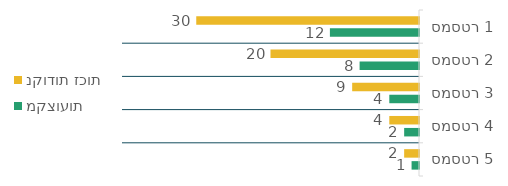
| Category | נקודות זכות  | מקצועות  |
|---|---|---|
| סמסטר 1 | 30 | 12 |
| סמסטר 2 | 20 | 8 |
| סמסטר 3 | 9 | 4 |
| סמסטר 4 | 4 | 2 |
| סמסטר 5 | 2 | 1 |